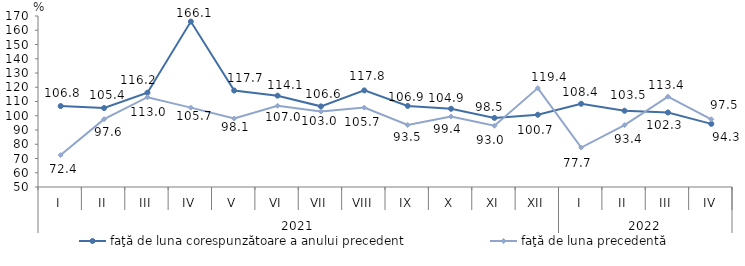
| Category | faţă de luna corespunzătoare a anului precedent | faţă de luna precedentă   |
|---|---|---|
| 0 | 106.8 | 72.4 |
| 1 | 105.4 | 97.6 |
| 2 | 116.2 | 113 |
| 3 | 166.1 | 105.7 |
| 4 | 117.7 | 98.1 |
| 5 | 114.1 | 107 |
| 6 | 106.6 | 103 |
| 7 | 117.8 | 105.7 |
| 8 | 106.9 | 93.5 |
| 9 | 104.9 | 99.4 |
| 10 | 98.5 | 93 |
| 11 | 100.7 | 119.4 |
| 12 | 108.4 | 77.7 |
| 13 | 103.5 | 93.4 |
| 14 | 102.3 | 113.4 |
| 15 | 94.3 | 97.5 |